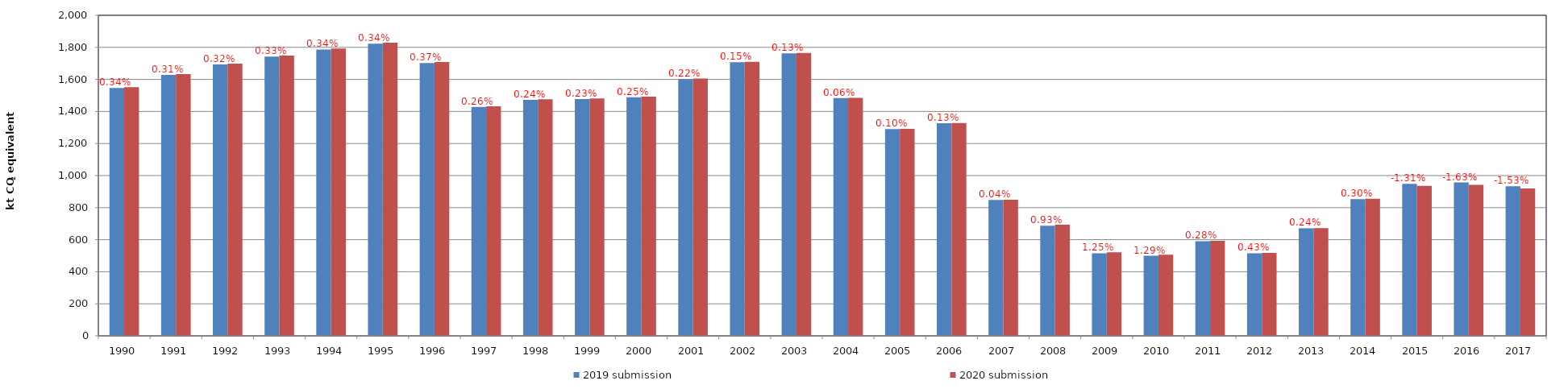
| Category | 2019 submission | 2020 submission |
|---|---|---|
| 1990.0 | 1546.8 | 1552.054 |
| 1991.0 | 1627.765 | 1632.811 |
| 1992.0 | 1692.86 | 1698.23 |
| 1993.0 | 1742.525 | 1748.282 |
| 1994.0 | 1786.795 | 1792.849 |
| 1995.0 | 1823.017 | 1829.178 |
| 1996.0 | 1702.174 | 1708.483 |
| 1997.0 | 1428.908 | 1432.626 |
| 1998.0 | 1472.032 | 1475.577 |
| 1999.0 | 1477.283 | 1480.705 |
| 2000.0 | 1489.093 | 1492.77 |
| 2001.0 | 1601.842 | 1605.349 |
| 2002.0 | 1707.602 | 1710.233 |
| 2003.0 | 1763.099 | 1765.468 |
| 2004.0 | 1484.204 | 1485.104 |
| 2005.0 | 1290.678 | 1291.968 |
| 2006.0 | 1326.397 | 1328.176 |
| 2007.0 | 848.509 | 848.836 |
| 2008.0 | 687.386 | 693.804 |
| 2009.0 | 515.205 | 521.647 |
| 2010.0 | 499.723 | 506.189 |
| 2011.0 | 590.771 | 592.432 |
| 2012.0 | 515.089 | 517.294 |
| 2013.0 | 671.034 | 672.621 |
| 2014.0 | 852.471 | 855.013 |
| 2015.0 | 948.75 | 936.301 |
| 2016.0 | 957.18 | 941.614 |
| 2017.0 | 933.402 | 919.16 |